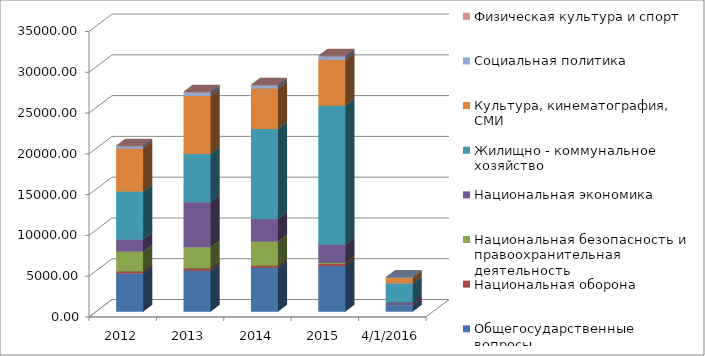
| Category | Общегосударственные вопросы | Национальная оборона | Национальная безопасность и правоохранительная деятельность | Национальная экономика | Жилищно - коммунальное хозяйство | Культура, кинематография, СМИ | Социальная политика | Физическая культура и спорт |
|---|---|---|---|---|---|---|---|---|
| 2012.0 | 4692.164 | 232.812 | 2451.473 | 1471.939 | 5881.889 | 5253.5 | 308.421 | 75 |
| 2013.0 | 5032.062 | 272.794 | 2592.465 | 5537.892 | 5891.897 | 7128.686 | 414.894 | 95 |
| 2014.0 | 5404.168 | 229.8 | 2963.109 | 2766.841 | 11028.448 | 4956.468 | 371.71 | 101 |
| 2015.0 | 5595.761 | 250.1 | 150 | 2216.367 | 17030.049 | 5608.309 | 449.08 | 101 |
| 42461.0 | 815.027 | 28.792 | 0 | 297.275 | 2341.841 | 664.147 | 74.86 | 20 |